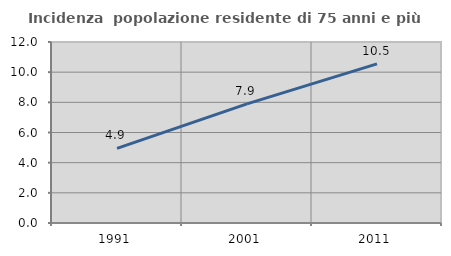
| Category | Incidenza  popolazione residente di 75 anni e più |
|---|---|
| 1991.0 | 4.945 |
| 2001.0 | 7.902 |
| 2011.0 | 10.549 |